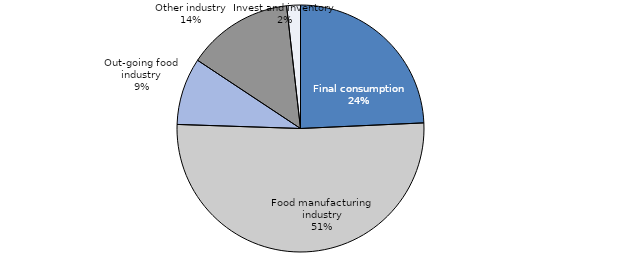
| Category | Series 0 |
|---|---|
| Final consumption | 0.243 |
| Food manufacturing industry | 0.513 |
| Out-going food industry | 0.088 |
| Other industry | 0.139 |
| Invest and inventory | 0.018 |